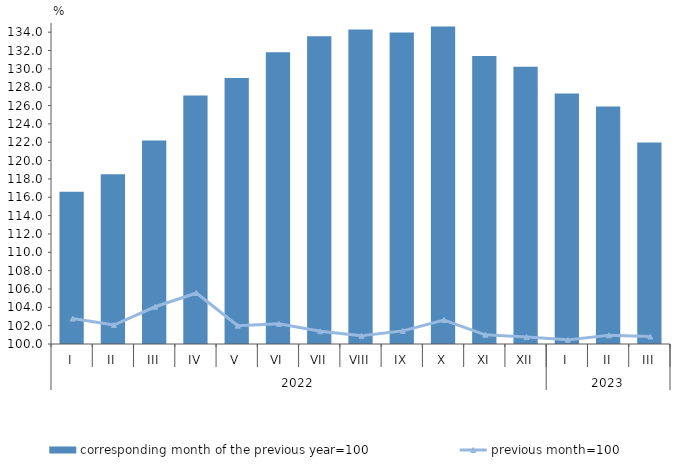
| Category | corresponding month of the previous year=100 |
|---|---|
| 0 | 116.6 |
| 1 | 118.5 |
| 2 | 122.2 |
| 3 | 127.1 |
| 4 | 129 |
| 5 | 131.8 |
| 6 | 133.55 |
| 7 | 134.29 |
| 8 | 133.97 |
| 9 | 134.62 |
| 10 | 131.4 |
| 11 | 130.24 |
| 12 | 127.307 |
| 13 | 125.905 |
| 14 | 121.977 |